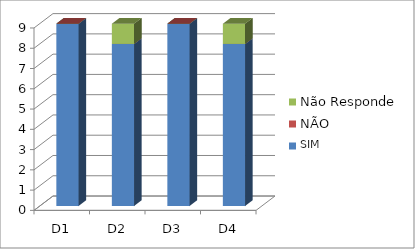
| Category | SIM | NÃO  | Não Responde |
|---|---|---|---|
| D1 | 9 | 0 | 0 |
| D2 | 8 | 0 | 1 |
| D3 | 9 | 0 | 0 |
| D4 | 8 | 0 | 1 |